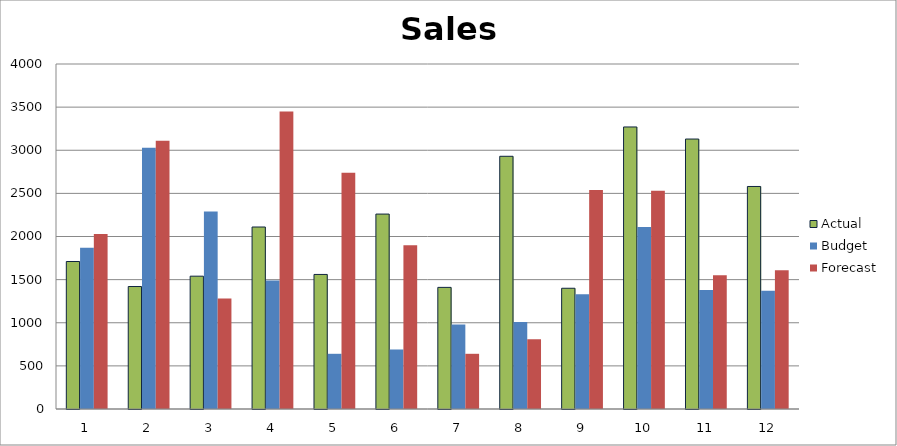
| Category | Actual | Budget | Forecast |
|---|---|---|---|
| 0 | 1710 | 1870 | 2030 |
| 1 | 1420 | 3030 | 3110 |
| 2 | 1540 | 2290 | 1280 |
| 3 | 2110 | 1490 | 3450 |
| 4 | 1560 | 640 | 2740 |
| 5 | 2260 | 690 | 1900 |
| 6 | 1410 | 980 | 640 |
| 7 | 2930 | 1010 | 810 |
| 8 | 1400 | 1330 | 2540 |
| 9 | 3270 | 2110 | 2530 |
| 10 | 3130 | 1380 | 1550 |
| 11 | 2580 | 1370 | 1610 |